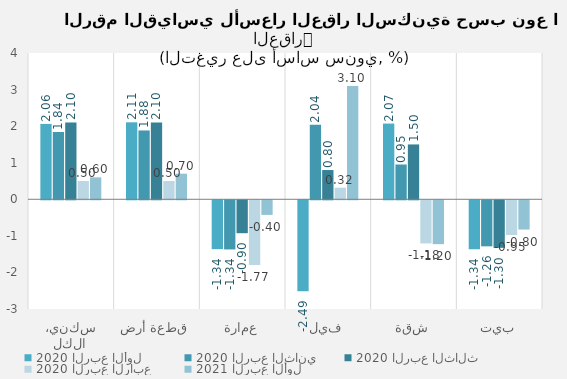
| Category | 2020 | 2021 |
|---|---|---|
| سكني، الكل | 0.5 | 0.6 |
| قطعة أرض | 0.5 | 0.7 |
| عمارة | -1.766 | -0.4 |
| فيلا | 0.316 | 3.1 |
| شقة | -1.18 | -1.2 |
| بيت | -0.95 | -0.8 |